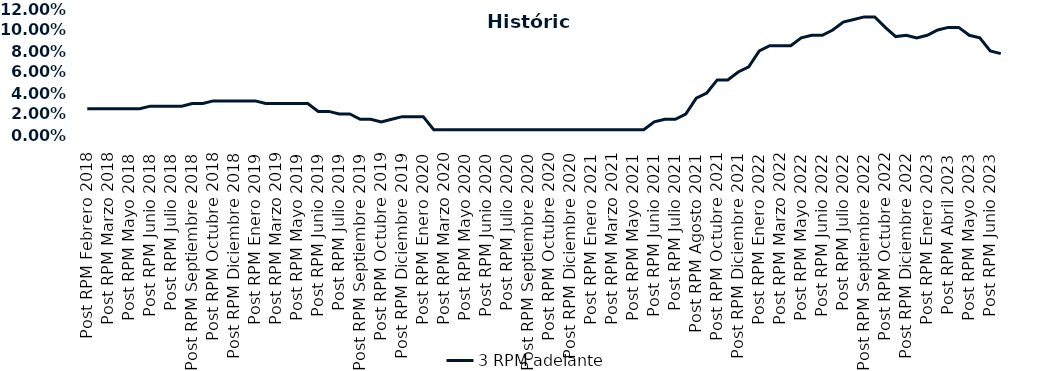
| Category | 3 RPM adelante |
|---|---|
| Post RPM Febrero 2018 | 0.025 |
| Pre RPM Marzo 2018 | 0.025 |
| Post RPM Marzo 2018 | 0.025 |
| Pre RPM Mayo 2018 | 0.025 |
| Post RPM Mayo 2018 | 0.025 |
| Pre RPM Junio 2018 | 0.025 |
| Post RPM Junio 2018 | 0.028 |
| Pre RPM Julio 2018 | 0.028 |
| Post RPM Julio 2018 | 0.028 |
| Pre RPM Septiembre 2018 | 0.028 |
| Post RPM Septiembre 2018 | 0.03 |
| Pre RPM Octubre 2018 | 0.03 |
| Post RPM Octubre 2018 | 0.032 |
| Pre RPM Diciembre 2018 | 0.032 |
| Post RPM Diciembre 2018 | 0.032 |
| Pre RPM Enero 2019 | 0.032 |
| Post RPM Enero 2019 | 0.032 |
| Pre RPM Marzo 2019 | 0.03 |
| Post RPM Marzo 2019 | 0.03 |
| Pre RPM Mayo 2019 | 0.03 |
| Post RPM Mayo 2019 | 0.03 |
| Pre RPM Junio 2019 | 0.03 |
| Post RPM Junio 2019 | 0.022 |
| Pre RPM Julio 2019 | 0.022 |
| Post RPM Julio 2019 | 0.02 |
| Pre RPM Septiembre 2019 | 0.02 |
| Post RPM Septiembre 2019 | 0.015 |
| Pre RPM Octubre 2019 | 0.015 |
| Post RPM Octubre 2019 | 0.012 |
| Pre RPM Diciembre 2019 | 0.015 |
| Post RPM Diciembre 2019 | 0.018 |
| Pre RPM Enero 2020 | 0.018 |
| Post RPM Enero 2020 | 0.018 |
| Pre RPM Marzo 2020 | 0.005 |
| Post RPM Marzo 2020 | 0.005 |
| Pre RPM Mayo 2020 | 0.005 |
| Post RPM Mayo 2020 | 0.005 |
| Pre RPM Junio 2020 | 0.005 |
| Post RPM Junio 2020 | 0.005 |
| Pre RPM Julio 2020 | 0.005 |
| Post RPM Julio 2020 | 0.005 |
| Pre RPM Septiembre 2020 | 0.005 |
| Post RPM Septiembre 2020 | 0.005 |
| Pre RPM Octubre 2020 | 0.005 |
| Post RPM Octubre 2020 | 0.005 |
| Pre RPM Diciembre 2020 | 0.005 |
| Post RPM Diciembre 2020 | 0.005 |
| Pre RPM Enero 2021 | 0.005 |
| Post RPM Enero 2021 | 0.005 |
| Pre RPM Marzo 2021 | 0.005 |
| Post RPM Marzo 2021 | 0.005 |
| Pre RPM Mayo 2021 | 0.005 |
| Post RPM Mayo 2021 | 0.005 |
| Pre RPM Junio 2021 | 0.005 |
| Post RPM Junio 2021 | 0.012 |
| Pre RPM Julio 2021 | 0.015 |
| Post RPM Julio 2021 | 0.015 |
| Pre RPM Agosto 2021 | 0.02 |
| Post RPM Agosto 2021 | 0.035 |
| Pre RPM Octubre 2021 | 0.04 |
| Post RPM Octubre 2021 | 0.052 |
| Pre RPM Diciembre 2021 | 0.052 |
| Post RPM Diciembre 2021 | 0.06 |
| Pre RPM Enero 2022 | 0.065 |
| Post RPM Enero 2022 | 0.08 |
| Pre RPM Marzo 2022 | 0.085 |
| Post RPM Marzo 2022 | 0.085 |
| Pre RPM Mayo 2022 | 0.085 |
| Post RPM Mayo 2022 | 0.092 |
| Pre RPM Junio 2022 | 0.095 |
| Post RPM Junio 2022 | 0.095 |
| Pre RPM Julio 2022 | 0.1 |
| Post RPM Julio 2022 | 0.108 |
| Pre RPM Septiembre 2022 | 0.11 |
| Post RPM Septiembre 2022 | 0.112 |
| Pre RPM Octubre 2022 | 0.112 |
| Post RPM Octubre 2022 | 0.102 |
| Pre RPM Diciembre 2022 | 0.094 |
| Post RPM Diciembre 2022 | 0.095 |
| Pre RPM Enero 2023 | 0.092 |
| Post RPM Enero 2023 | 0.095 |
| Pre RPM Abril 2023 | 0.1 |
| Post RPM Abril 2023 | 0.102 |
| Pre RPM Mayo 2023 | 0.102 |
| Post RPM Mayo 2023 | 0.095 |
| Pre RPM Junio 2023 | 0.092 |
| Post RPM Junio 2023 | 0.08 |
| Pre RPM Julio 2023 | 0.078 |